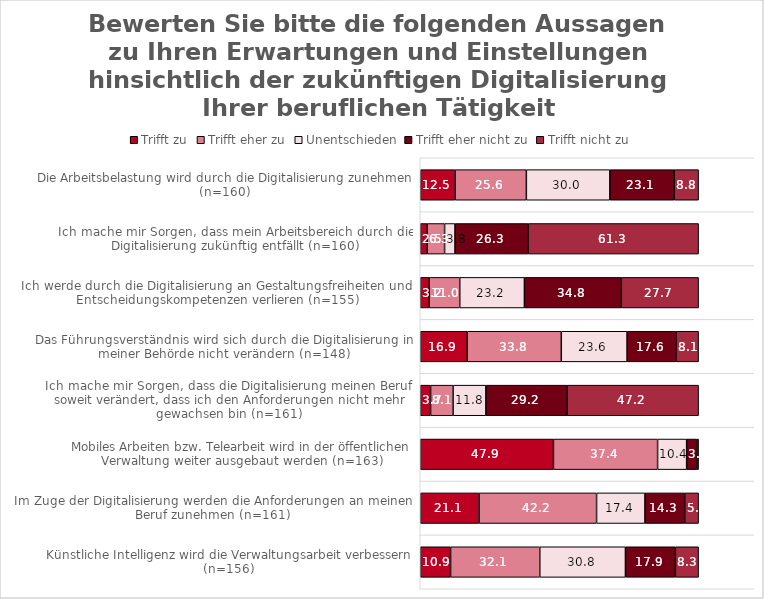
| Category | Trifft zu | Trifft eher zu | Unentschieden | Trifft eher nicht zu | Trifft nicht zu |
|---|---|---|---|---|---|
| Künstliche Intelligenz wird die Verwaltungsarbeit verbessern (n=156) | 10.897 | 32.051 | 30.769 | 17.949 | 8.333 |
| Im Zuge der Digitalisierung werden die Anforderungen an meinen Beruf zunehmen (n=161) | 21.118 | 42.236 | 17.391 | 14.286 | 4.969 |
| Mobiles Arbeiten bzw. Telearbeit wird in der öffentlichen Verwaltung weiter ausgebaut werden (n=163) | 47.853 | 37.423 | 10.429 | 3.681 | 0.613 |
| Ich mache mir Sorgen, dass die Digitalisierung meinen Beruf soweit verändert, dass ich den Anforderungen nicht mehr gewachsen bin (n=161) | 3.727 | 8.075 | 11.801 | 29.193 | 47.205 |
| Das Führungsverständnis wird sich durch die Digitalisierung in meiner Behörde nicht verändern (n=148) | 16.892 | 33.784 | 23.649 | 17.568 | 8.108 |
| Ich werde durch die Digitalisierung an Gestaltungsfreiheiten und Entscheidungskompetenzen verlieren (n=155) | 3.226 | 10.968 | 23.226 | 34.839 | 27.742 |
| Ich mache mir Sorgen, dass mein Arbeitsbereich durch die Digitalisierung zukünftig entfällt (n=160) | 2.5 | 6.25 | 3.75 | 26.25 | 61.25 |
| Die Arbeitsbelastung wird durch die Digitalisierung zunehmen (n=160) | 12.5 | 25.625 | 30 | 23.125 | 8.75 |